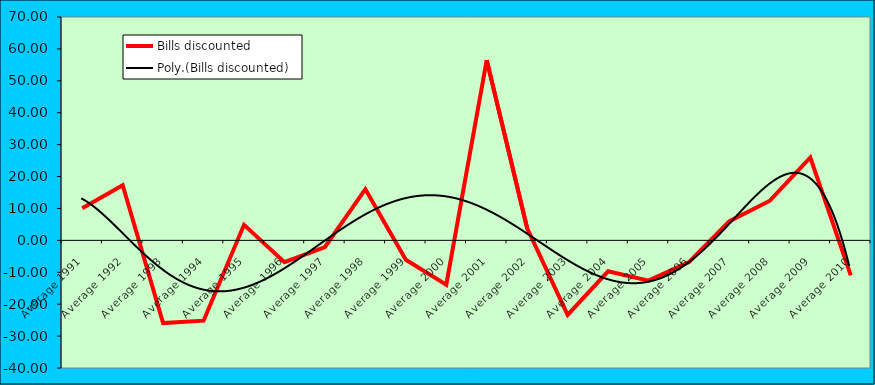
| Category | Bills discounted |
|---|---|
| Average 1991 | 10.042 |
| Average 1992 | 17.295 |
| Average 1993 | -25.925 |
| Average 1994 | -25.172 |
| Average 1995 | 4.88 |
| Average 1996 | -6.836 |
| Average 1997 | -2.085 |
| Average 1998 | 16.055 |
| Average 1999 | -6.067 |
| Average 2000 | -13.896 |
| Average 2001 | 56.494 |
| Average 2002 | 3.8 |
| Average 2003 | -23.373 |
| Average 2004 | -9.691 |
| Average 2005 | -12.635 |
| Average 2006 | -6.814 |
| Average 2007 | 6.033 |
| Average 2008 | 12.426 |
| Average 2009 | 25.971 |
| Average 2010 | -11.003 |